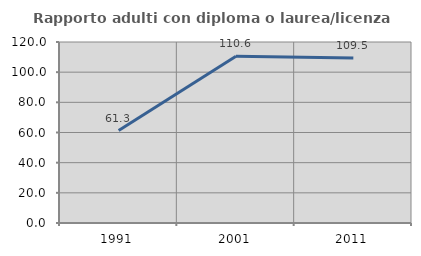
| Category | Rapporto adulti con diploma o laurea/licenza media  |
|---|---|
| 1991.0 | 61.268 |
| 2001.0 | 110.606 |
| 2011.0 | 109.474 |